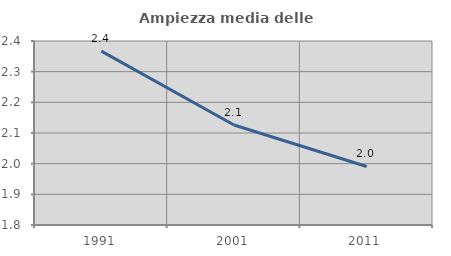
| Category | Ampiezza media delle famiglie |
|---|---|
| 1991.0 | 2.367 |
| 2001.0 | 2.126 |
| 2011.0 | 1.991 |